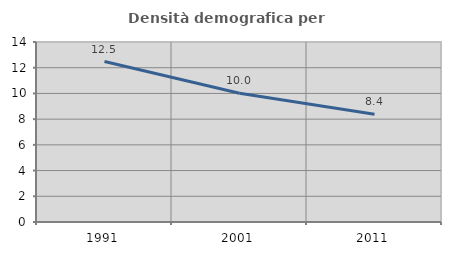
| Category | Densità demografica |
|---|---|
| 1991.0 | 12.477 |
| 2001.0 | 10.009 |
| 2011.0 | 8.382 |